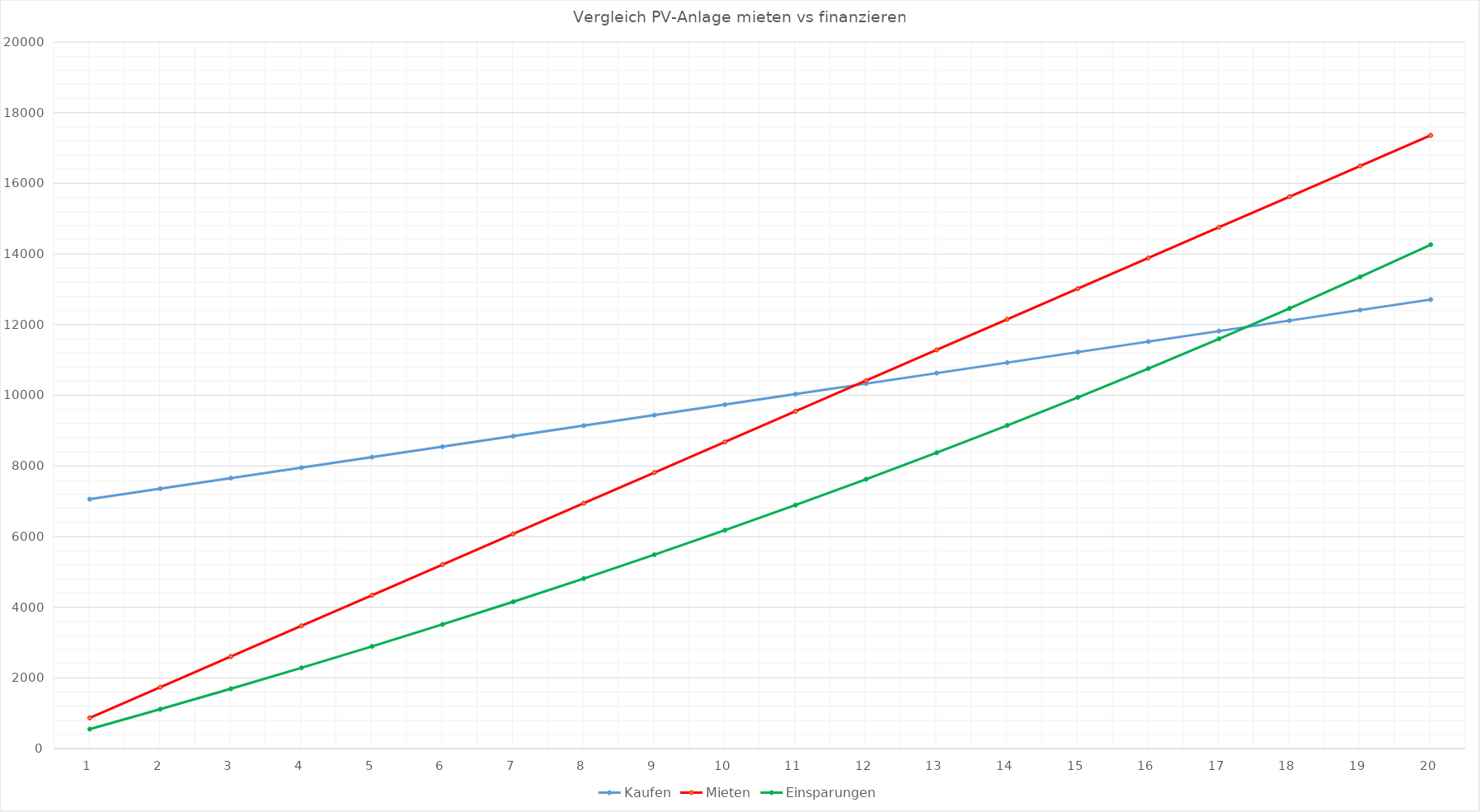
| Category | Kaufen | Mieten | Einsparungen |
|---|---|---|---|
| 0 | 7057.5 | 868 | 549.483 |
| 1 | 7355 | 1736 | 1112.807 |
| 2 | 7652.5 | 2604 | 1690.458 |
| 3 | 7950 | 3472 | 2282.936 |
| 4 | 8247.5 | 4340 | 2890.761 |
| 5 | 8545 | 5208 | 3514.471 |
| 6 | 8842.5 | 6076 | 4154.62 |
| 7 | 9140 | 6944 | 4811.784 |
| 8 | 9437.5 | 7812 | 5486.559 |
| 9 | 9735 | 8680 | 6179.561 |
| 10 | 10032.5 | 9548 | 6891.428 |
| 11 | 10330 | 10416 | 7622.82 |
| 12 | 10627.5 | 11284 | 8374.422 |
| 13 | 10925 | 12152 | 9146.939 |
| 14 | 11222.5 | 13020 | 9941.104 |
| 15 | 11520 | 13888 | 10757.675 |
| 16 | 11817.5 | 14756 | 11597.436 |
| 17 | 12115 | 15624 | 12461.199 |
| 18 | 12412.5 | 16492 | 13349.804 |
| 19 | 12710 | 17360 | 14264.119 |